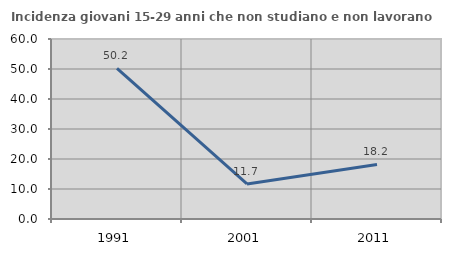
| Category | Incidenza giovani 15-29 anni che non studiano e non lavorano  |
|---|---|
| 1991.0 | 50.202 |
| 2001.0 | 11.698 |
| 2011.0 | 18.2 |